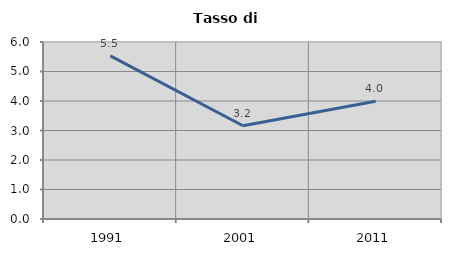
| Category | Tasso di disoccupazione   |
|---|---|
| 1991.0 | 5.532 |
| 2001.0 | 3.159 |
| 2011.0 | 3.992 |